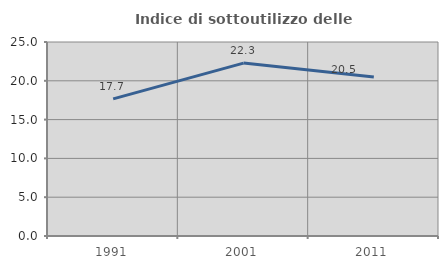
| Category | Indice di sottoutilizzo delle abitazioni  |
|---|---|
| 1991.0 | 17.674 |
| 2001.0 | 22.283 |
| 2011.0 | 20.495 |